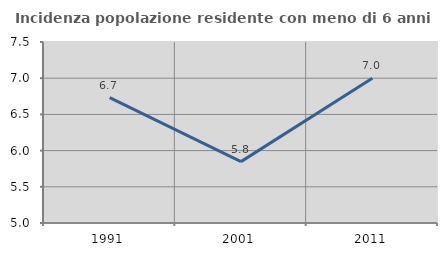
| Category | Incidenza popolazione residente con meno di 6 anni |
|---|---|
| 1991.0 | 6.731 |
| 2001.0 | 5.848 |
| 2011.0 | 7.001 |